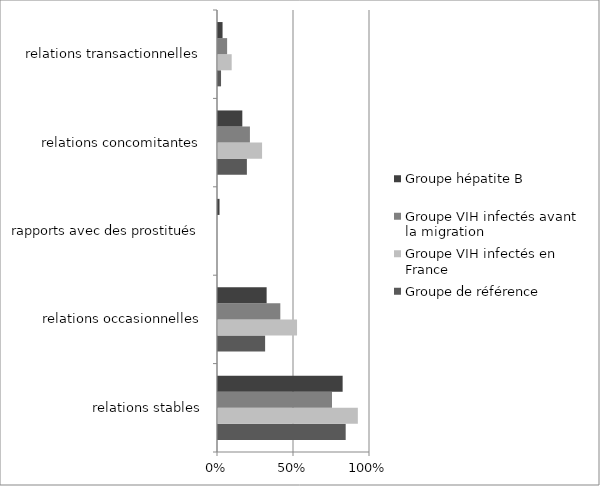
| Category | Groupe de référence | Groupe VIH infectés en France | Groupe VIH infectés avant la migration | Groupe hépatite B |
|---|---|---|---|---|
| relations stables | 0.84 | 0.92 | 0.75 | 0.82 |
| relations occasionnelles | 0.31 | 0.52 | 0.41 | 0.32 |
| rapports avec des prostitués | 0 | 0 | 0 | 0.01 |
| relations concomitantes | 0.19 | 0.29 | 0.21 | 0.16 |
| relations transactionnelles | 0.02 | 0.09 | 0.06 | 0.03 |